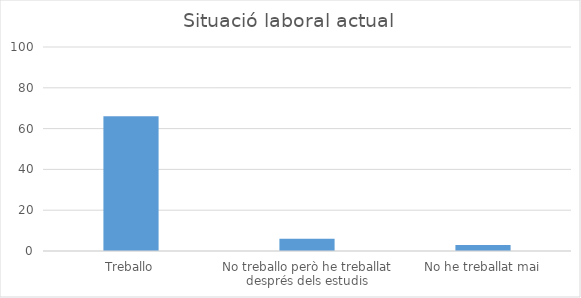
| Category | Series 0 |
|---|---|
| Treballo | 66 |
| No treballo però he treballat després dels estudis | 6 |
| No he treballat mai | 3 |